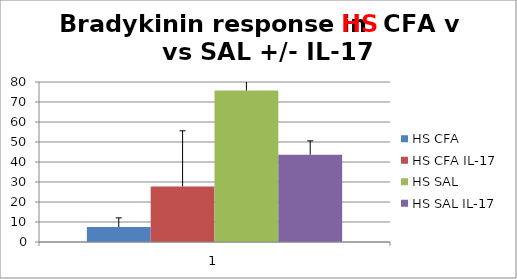
| Category | HS CFA | HS CFA IL-17 | HS SAL | HS SAL IL-17 |
|---|---|---|---|---|
| 0 | 7.455 | 27.8 | 75.733 | 43.675 |